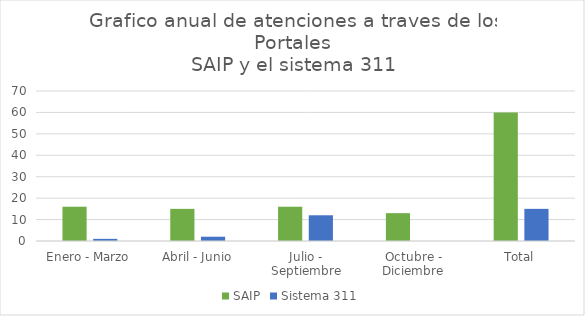
| Category | SAIP | Sistema 311 |
|---|---|---|
| Enero - Marzo | 16 | 1 |
| Abril - Junio | 15 | 2 |
| Julio - Septiembre | 16 | 12 |
| Octubre - Diciembre | 13 | 0 |
| Total | 60 | 15 |